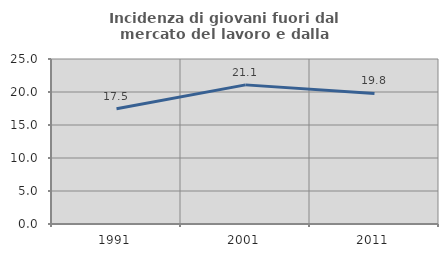
| Category | Incidenza di giovani fuori dal mercato del lavoro e dalla formazione  |
|---|---|
| 1991.0 | 17.468 |
| 2001.0 | 21.079 |
| 2011.0 | 19.78 |